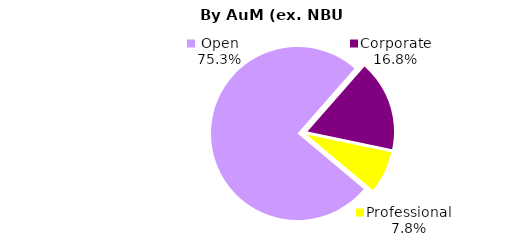
| Category | Series 0 |
|---|---|
| Open | 1441.356 |
| Corporate | 321.944 |
| Professional | 149.909 |